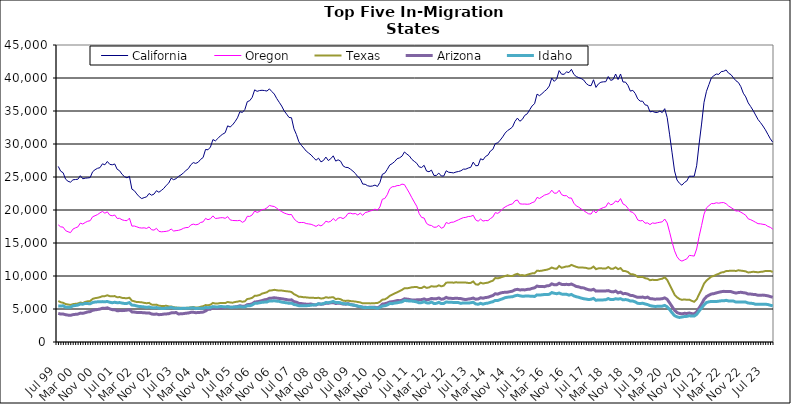
| Category |  California  |  Oregon  |  Texas  |  Arizona  |  Idaho  |
|---|---|---|---|---|---|
| Jul 99 | 26605 | 17749 | 6209 | 4339 | 5471 |
| Aug 99 | 25882 | 17447 | 6022 | 4228 | 5444 |
| Sep 99 | 25644 | 17401 | 5941 | 4237 | 5488 |
| Oct 99 | 24669 | 16875 | 5751 | 4134 | 5279 |
| Nov 99 | 24353 | 16701 | 5680 | 4073 | 5260 |
| Dec 99 | 24218 | 16570 | 5619 | 4042 | 5269 |
| Jan 00 | 24574 | 17109 | 5736 | 4142 | 5485 |
| Feb 00 | 24620 | 17295 | 5789 | 4192 | 5530 |
| Mar 00 | 24655 | 17436 | 5826 | 4226 | 5590 |
| Apr 00 | 25195 | 18009 | 5980 | 4375 | 5748 |
| May 00 | 24730 | 17875 | 5897 | 4337 | 5729 |
| Jun 00 | 24825 | 18113 | 6070 | 4444 | 5853 |
| Jul 00 | 24857 | 18294 | 6163 | 4555 | 5824 |
| Aug 00 | 24913 | 18376 | 6199 | 4603 | 5788 |
| Sep 00 | 25792 | 18971 | 6529 | 4804 | 5976 |
| Oct 00 | 26106 | 19135 | 6643 | 4870 | 6058 |
| Nov 00 | 26315 | 19306 | 6705 | 4926 | 6085 |
| Dec 00 | 26415 | 19570 | 6793 | 4991 | 6096 |
| Jan 01 | 26995 | 19781 | 6942 | 5122 | 6119 |
| Feb 01 | 26851 | 19519 | 6948 | 5089 | 6090 |
| Mar 01 | 27352 | 19720 | 7080 | 5180 | 6143 |
| Apr 01 | 26918 | 19221 | 6943 | 5020 | 6020 |
| May 01 | 26848 | 19126 | 6924 | 4899 | 5950 |
| Jun 01 | 26974 | 19241 | 6959 | 4895 | 6019 |
| Jul 01 | 26172 | 18725 | 6778 | 4737 | 5951 |
| Aug 01 | 25943 | 18736 | 6810 | 4757 | 5973 |
| Sep 01 | 25399 | 18514 | 6688 | 4753 | 5895 |
| Oct 01 | 25050 | 18415 | 6650 | 4780 | 5833 |
| Nov 01 | 24873 | 18381 | 6631 | 4826 | 5850 |
| Dec 01 | 25099 | 18765 | 6708 | 4898 | 5969 |
| Jan 02 | 23158 | 17561 | 6261 | 4560 | 5595 |
| Feb 02 | 22926 | 17573 | 6162 | 4531 | 5560 |
| Mar 02 | 22433 | 17452 | 6052 | 4481 | 5458 |
| Apr 02 | 22012 | 17314 | 6046 | 4458 | 5380 |
| May 02 | 21733 | 17267 | 6007 | 4452 | 5358 |
| Jun 02 | 21876 | 17298 | 5933 | 4444 | 5315 |
| Jul 02 | 21997 | 17209 | 5873 | 4383 | 5243 |
| Aug 02 | 22507 | 17436 | 5929 | 4407 | 5315 |
| Sep 02 | 22244 | 17010 | 5672 | 4248 | 5192 |
| Oct 02 | 22406 | 16952 | 5625 | 4191 | 5167 |
| Nov 02 | 22922 | 17223 | 5663 | 4242 | 5221 |
| Dec 02 | 22693 | 16770 | 5499 | 4142 | 5120 |
| Jan 03 | 22964 | 16694 | 5463 | 4166 | 5089 |
| Feb 03 | 23276 | 16727 | 5461 | 4226 | 5077 |
| Mar 03 | 23736 | 16766 | 5486 | 4251 | 5145 |
| Apr 03 | 24079 | 16859 | 5389 | 4289 | 5145 |
| May 03 | 24821 | 17117 | 5378 | 4415 | 5254 |
| Jun 03 | 24592 | 16812 | 5273 | 4426 | 5135 |
| Jul 03 | 24754 | 16875 | 5226 | 4466 | 5124 |
| Aug 03 | 25092 | 16922 | 5181 | 4244 | 5100 |
| Sep 03 | 25316 | 17036 | 5181 | 4279 | 5086 |
| Oct 03 | 25622 | 17228 | 5139 | 4301 | 5110 |
| Nov 03 | 25984 | 17335 | 5175 | 4362 | 5091 |
| Dec 03 | 26269 | 17350 | 5189 | 4396 | 5113 |
| Jan 04 | 26852 | 17734 | 5255 | 4492 | 5152 |
| Feb 04 | 27184 | 17860 | 5301 | 4502 | 5183 |
| Mar 04 | 27062 | 17757 | 5227 | 4443 | 5056 |
| Apr 04 | 27238 | 17840 | 5227 | 4461 | 5104 |
| May 04 | 27671 | 18113 | 5345 | 4493 | 5095 |
| Jun 04 | 27949 | 18201 | 5416 | 4532 | 5103 |
| Jul 04 | 29172 | 18727 | 5597 | 4697 | 5231 |
| Aug 04 | 29122 | 18529 | 5561 | 4945 | 5197 |
| Sep 04 | 29542 | 18678 | 5656 | 4976 | 5237 |
| Oct 04 | 30674 | 19108 | 5922 | 5188 | 5363 |
| Nov 04 | 30472 | 18716 | 5823 | 5106 | 5321 |
| Dec 04 | 30831 | 18755 | 5838 | 5135 | 5312 |
| Jan 05 | 31224 | 18823 | 5906 | 5155 | 5374 |
| Feb 05 | 31495 | 18842 | 5898 | 5168 | 5357 |
| Mar 05 | 31714 | 18738 | 5894 | 5212 | 5313 |
| Apr 05 | 32750 | 18998 | 6060 | 5340 | 5350 |
| May 05 | 32575 | 18504 | 5989 | 5269 | 5276 |
| Jun 05 | 32898 | 18414 | 5954 | 5252 | 5271 |
| Jul 05 | 33384 | 18395 | 6062 | 5322 | 5322 |
| Aug 05 | 33964 | 18381 | 6113 | 5375 | 5316 |
| Sep 05 | 34897 | 18426 | 6206 | 5493 | 5362 |
| Oct 05 | 34780 | 18132 | 6100 | 5408 | 5308 |
| Nov 05 | 35223 | 18332 | 6162 | 5434 | 5314 |
| Dec 05 | 36415 | 19047 | 6508 | 5658 | 5487 |
| Jan 06 | 36567 | 19032 | 6576 | 5688 | 5480 |
| Feb 06 | 37074 | 19257 | 6692 | 5792 | 5616 |
| Mar 06 | 38207 | 19845 | 6993 | 6052 | 5850 |
| Apr 06 | 37976 | 19637 | 7024 | 6101 | 5864 |
| May 06 | 38099 | 19781 | 7114 | 6178 | 5943 |
| Jun 06 | 38141 | 20061 | 7331 | 6276 | 6018 |
| Jul 06 | 38097 | 20111 | 7431 | 6399 | 6046 |
| Aug 06 | 38021 | 20333 | 7542 | 6450 | 6064 |
| Sep 06 | 38349 | 20686 | 7798 | 6627 | 6232 |
| Oct 06 | 37947 | 20591 | 7825 | 6647 | 6216 |
| Nov 06 | 37565 | 20526 | 7907 | 6707 | 6244 |
| Dec 06 | 36884 | 20272 | 7840 | 6648 | 6192 |
| Jan 07 | 36321 | 19984 | 7789 | 6597 | 6151 |
| Feb 07 | 35752 | 19752 | 7799 | 6554 | 6048 |
| Mar 07 | 35025 | 19547 | 7737 | 6487 | 5989 |
| Apr 07 | 34534 | 19412 | 7685 | 6430 | 5937 |
| May 07 | 34022 | 19296 | 7654 | 6353 | 5858 |
| Jun 07 | 33974 | 19318 | 7577 | 6390 | 5886 |
| Jul 07 | 32298 | 18677 | 7250 | 6117 | 5682 |
| Aug 07 | 31436 | 18322 | 7070 | 6034 | 5617 |
| Sep 07 | 30331 | 18087 | 6853 | 5847 | 5500 |
| Oct 07 | 29813 | 18108 | 6839 | 5821 | 5489 |
| Nov 07 | 29384 | 18105 | 6777 | 5769 | 5481 |
| Dec 07 | 28923 | 17949 | 6760 | 5733 | 5499 |
| Jan 08 | 28627 | 17890 | 6721 | 5732 | 5521 |
| Feb 08 | 28328 | 17834 | 6719 | 5749 | 5579 |
| Mar 08 | 27911 | 17680 | 6690 | 5650 | 5614 |
| Apr 08 | 27543 | 17512 | 6656 | 5612 | 5635 |
| May 08 | 27856 | 17754 | 6705 | 5774 | 5798 |
| Jun 08 | 27287 | 17589 | 6593 | 5717 | 5745 |
| Jul 08 | 27495 | 17834 | 6623 | 5761 | 5807 |
| Aug 08 | 28018 | 18309 | 6789 | 5867 | 5982 |
| Sep-08 | 27491 | 18164 | 6708 | 5864 | 5954 |
| Oct 08 | 27771 | 18291 | 6755 | 5942 | 6032 |
| Nov 08 | 28206 | 18706 | 6787 | 5970 | 6150 |
| Dec 08 | 27408 | 18353 | 6505 | 5832 | 5975 |
| Jan 09 | 27601 | 18778 | 6569 | 5890 | 5995 |
| Feb 09 | 27394 | 18863 | 6483 | 5845 | 5936 |
| Mar 09 | 26690 | 18694 | 6273 | 5751 | 5806 |
| Apr 09 | 26461 | 18943 | 6222 | 5735 | 5777 |
| May 09 | 26435 | 19470 | 6272 | 5819 | 5767 |
| Jun 09 | 26187 | 19522 | 6199 | 5700 | 5649 |
| Jul 09 | 25906 | 19408 | 6171 | 5603 | 5617 |
| Aug 09 | 25525 | 19469 | 6128 | 5533 | 5540 |
| Sep 09 | 25050 | 19249 | 6059 | 5405 | 5437 |
| Oct 09 | 24741 | 19529 | 6004 | 5349 | 5369 |
| Nov 09 | 23928 | 19187 | 5854 | 5271 | 5248 |
| Dec 09 | 23899 | 19607 | 5886 | 5261 | 5195 |
| Jan 10 | 23676 | 19703 | 5881 | 5232 | 5234 |
| Feb 10 | 23592 | 19845 | 5850 | 5272 | 5236 |
| Mar 10 | 23634 | 19946 | 5864 | 5278 | 5219 |
| Apr 10 | 23774 | 20134 | 5889 | 5257 | 5201 |
| May 10 | 23567 | 19966 | 5897 | 5172 | 5105 |
| Jun 10 | 24166 | 20464 | 6087 | 5356 | 5237 |
| Jul 10 | 25410 | 21627 | 6417 | 5742 | 5452 |
| Aug 10 | 25586 | 21744 | 6465 | 5797 | 5491 |
| Sep 10 | 26150 | 22314 | 6667 | 5907 | 5609 |
| Oct 10 | 26807 | 23219 | 6986 | 6070 | 5831 |
| Nov 10 | 27033 | 23520 | 7179 | 6100 | 5810 |
| Dec 10 | 27332 | 23551 | 7361 | 6182 | 5898 |
| Jan 11 | 27769 | 23697 | 7525 | 6276 | 5938 |
| Feb 11 | 27898 | 23718 | 7708 | 6267 | 6016 |
| Mar 11 | 28155 | 23921 | 7890 | 6330 | 6081 |
| Apr 11 | 28790 | 23847 | 8146 | 6544 | 6305 |
| May 11 | 28471 | 23215 | 8131 | 6502 | 6248 |
| Jun 11 | 28191 | 22580 | 8199 | 6445 | 6217 |
| Jul 11 | 27678 | 21867 | 8291 | 6368 | 6202 |
| Aug 11 | 27372 | 21203 | 8321 | 6356 | 6146 |
| Sep 11 | 27082 | 20570 | 8341 | 6387 | 6075 |
| Oct 11 | 26528 | 19442 | 8191 | 6402 | 5932 |
| Nov 11 | 26440 | 18872 | 8176 | 6426 | 5968 |
| Dec 11 | 26770 | 18784 | 8401 | 6533 | 6106 |
| Jan 12 | 25901 | 17963 | 8202 | 6390 | 5933 |
| Feb 12 | 25796 | 17718 | 8266 | 6456 | 5900 |
| Mar 12 | 26042 | 17647 | 8456 | 6600 | 6054 |
| Apr 12 | 25239 | 17386 | 8388 | 6534 | 5838 |
| May 12 | 25238 | 17407 | 8401 | 6558 | 5854 |
| Jun 12 | 25593 | 17673 | 8594 | 6669 | 6009 |
| Jul 12 | 25155 | 17237 | 8432 | 6474 | 5817 |
| Aug 12 | 25146 | 17391 | 8536 | 6539 | 5842 |
| Sep 12 | 25942 | 18102 | 8989 | 6759 | 6061 |
| Oct 12 | 25718 | 17953 | 9012 | 6618 | 6027 |
| Nov 12 | 25677 | 18134 | 9032 | 6611 | 6009 |
| Dec 12 | 25619 | 18166 | 8981 | 6601 | 5999 |
| Jan 13 | 25757 | 18344 | 9051 | 6627 | 5989 |
| Feb-13 | 25830 | 18512 | 9001 | 6606 | 5968 |
| Mar-13 | 25940 | 18689 | 9021 | 6577 | 5853 |
| Apr 13 | 26187 | 18844 | 9013 | 6478 | 5925 |
| May 13 | 26192 | 18884 | 9003 | 6431 | 5924 |
| Jun-13 | 26362 | 19013 | 8948 | 6508 | 5896 |
| Jul 13 | 26467 | 19037 | 8958 | 6559 | 5948 |
| Aug 13 | 27253 | 19198 | 9174 | 6655 | 6020 |
| Sep 13 | 26711 | 18501 | 8747 | 6489 | 5775 |
| Oct 13 | 26733 | 18301 | 8681 | 6511 | 5711 |
| Nov 13 | 27767 | 18620 | 8989 | 6709 | 5860 |
| Dec 13 | 27583 | 18320 | 8863 | 6637 | 5740 |
| Jan 14 | 28107 | 18409 | 8939 | 6735 | 5843 |
| Feb-14 | 28313 | 18383 | 8989 | 6779 | 5893 |
| Mar 14 | 28934 | 18696 | 9160 | 6918 | 6015 |
| Apr 14 | 29192 | 18946 | 9291 | 7036 | 6099 |
| May 14 | 30069 | 19603 | 9701 | 7314 | 6304 |
| Jun 14 | 30163 | 19487 | 9641 | 7252 | 6293 |
| Jul-14 | 30587 | 19754 | 9752 | 7415 | 6427 |
| Aug-14 | 31074 | 20201 | 9882 | 7499 | 6557 |
| Sep 14 | 31656 | 20459 | 9997 | 7536 | 6719 |
| Oct 14 | 32037 | 20663 | 10109 | 7555 | 6786 |
| Nov 14 | 32278 | 20825 | 9992 | 7628 | 6831 |
| Dec 14 | 32578 | 20918 | 10006 | 7705 | 6860 |
| Jan 15 | 33414 | 21396 | 10213 | 7906 | 7000 |
| Feb 15 | 33922 | 21518 | 10337 | 7982 | 7083 |
| Mar 15 | 33447 | 20942 | 10122 | 7891 | 7006 |
| Apr-15 | 33731 | 20893 | 10138 | 7906 | 6931 |
| May 15 | 34343 | 20902 | 10053 | 7895 | 6952 |
| Jun-15 | 34572 | 20870 | 10192 | 7973 | 6966 |
| Jul 15 | 35185 | 20916 | 10303 | 8000 | 6949 |
| Aug 15 | 35780 | 21115 | 10399 | 8126 | 6938 |
| Sep 15 | 36109 | 21246 | 10428 | 8207 | 6896 |
| Oct 15 | 37555 | 21908 | 10813 | 8477 | 7140 |
| Nov 15 | 37319 | 21750 | 10763 | 8390 | 7112 |
| Dec 15 | 37624 | 21990 | 10807 | 8395 | 7149 |
| Jan 16 | 37978 | 22248 | 10892 | 8388 | 7201 |
| Feb 16 | 38285 | 22369 | 10951 | 8508 | 7192 |
| Mar 16 | 38792 | 22506 | 11075 | 8547 | 7226 |
| Apr 16 | 39994 | 22999 | 11286 | 8815 | 7487 |
| May 16 | 39488 | 22548 | 11132 | 8673 | 7382 |
| Jun 16 | 39864 | 22556 | 11100 | 8682 | 7315 |
| Jul 16 | 41123 | 22989 | 11516 | 8903 | 7420 |
| Aug 16 | 40573 | 22333 | 11251 | 8731 | 7261 |
| Sep 16 | 40560 | 22162 | 11340 | 8692 | 7216 |
| Oct 16 | 40923 | 22172 | 11456 | 8742 | 7233 |
| Nov 16 | 40817 | 21818 | 11459 | 8685 | 7101 |
| Dec 16 | 41311 | 21815 | 11681 | 8783 | 7203 |
| Jan 17 | 40543 | 21029 | 11524 | 8609 | 6982 |
| Feb 17 | 40218 | 20613 | 11385 | 8416 | 6852 |
| Mar 17 | 40052 | 20425 | 11276 | 8354 | 6775 |
| Apr 17 | 39913 | 20147 | 11297 | 8218 | 6653 |
| May 17 | 39695 | 19910 | 11265 | 8196 | 6552 |
| Jun 17 | 39177 | 19650 | 11225 | 8034 | 6500 |
| Jul 17 | 38901 | 19419 | 11115 | 7923 | 6429 |
| Aug 17 | 38827 | 19389 | 11168 | 7867 | 6479 |
| Sep 17 | 39736 | 19936 | 11426 | 7991 | 6609 |
| Oct 17 | 38576 | 19547 | 11041 | 7708 | 6315 |
| Nov 17 | 39108 | 20013 | 11158 | 7746 | 6381 |
| Dec 17 | 39359 | 20202 | 11185 | 7743 | 6366 |
| Jan 18 | 39420 | 20362 | 11118 | 7736 | 6380 |
| Feb 18 | 39440 | 20476 | 11128 | 7741 | 6407 |
| Mar 18 | 40218 | 21106 | 11362 | 7789 | 6578 |
| Apr 18 | 39637 | 20788 | 11111 | 7642 | 6423 |
| May 18 | 39777 | 20933 | 11097 | 7591 | 6430 |
| Jun 18 | 40602 | 21381 | 11317 | 7721 | 6554 |
| Jul 18 | 39767 | 21189 | 11038 | 7445 | 6489 |
| Aug 18 | 40608 | 21729 | 11200 | 7560 | 6569 |
| Sep 18 | 39395 | 20916 | 10772 | 7318 | 6383 |
| Oct 18 | 39383 | 20724 | 10740 | 7344 | 6429 |
| Nov 18 | 38891 | 20265 | 10605 | 7255 | 6365 |
| Dec 18 | 38013 | 19741 | 10292 | 7069 | 6205 |
| Jan 19 | 38130 | 19643 | 10261 | 7032 | 6203 |
| Feb 19 | 37658 | 19237 | 10132 | 6892 | 6073 |
| Mar 19 | 36831 | 18492 | 9848 | 6766 | 5863 |
| Apr 19 | 36492 | 18349 | 9839 | 6763 | 5827 |
| May 19 | 36481 | 18407 | 9867 | 6809 | 5873 |
| Jun 19 | 35925 | 17998 | 9661 | 6698 | 5761 |
| Jul 19 | 35843 | 18049 | 9598 | 6800 | 5673 |
| Aug 19 | 34870 | 17785 | 9361 | 6577 | 5512 |
| Sep 19 | 34945 | 18038 | 9428 | 6547 | 5437 |
| Oct 19 | 34802 | 17977 | 9385 | 6483 | 5390 |
| Nov 19 | 34775 | 18072 | 9403 | 6511 | 5401 |
| Dec 19 | 34976 | 18140 | 9518 | 6521 | 5419 |
| Jan 20 | 34774 | 18209 | 9594 | 6561 | 5434 |
| Feb 20 | 35352 | 18632 | 9804 | 6682 | 5543 |
| Mar 20 | 34013 | 18041 | 9411 | 6464 | 5330 |
| Apr 20 | 31385 | 16629 | 8666 | 5922 | 4906 |
| May 20 | 28657 | 15123 | 7927 | 5355 | 4419 |
| Jun 20 | 25915 | 13817 | 7164 | 4815 | 3992 |
| Jul 20 | 24545 | 12926 | 6776 | 4457 | 3810 |
| Aug 20 | 24048 | 12443 | 6521 | 4326 | 3720 |
| Sep 20 | 23756 | 12258 | 6386 | 4266 | 3784 |
| Oct 20 | 24166 | 12429 | 6452 | 4347 | 3861 |
| Nov 20 | 24404 | 12597 | 6386 | 4324 | 3883 |
| Dec 20 | 25120 | 13122 | 6420 | 4394 | 3974 |
| Jan 21 | 25111 | 13080 | 6236 | 4304 | 3924 |
| Feb 21 | 25114 | 13015 | 6094 | 4260 | 3930 |
| Mar 21 | 26701 | 14096 | 6455 | 4567 | 4185 |
| Apr 21 | 29998 | 15978 | 7222 | 5164 | 4697 |
| May 21 | 33020 | 17641 | 7969 | 5748 | 5148 |
| Jun 21 | 36320 | 19369 | 8840 | 6450 | 5628 |
| Jul 21 | 37989 | 20320 | 9306 | 6877 | 5984 |
| Aug 21 | 39007 | 20657 | 9615 | 7094 | 6084 |
| Sep 21 | 40023 | 20974 | 9914 | 7277 | 6151 |
| Oct 21 | 40348 | 20966 | 10003 | 7327 | 6140 |
| Nov 21 | 40599 | 21096 | 10203 | 7437 | 6136 |
| Dec 21 | 40548 | 21032 | 10328 | 7532 | 6183 |
| Jan 22 | 40967 | 21106 | 10535 | 7618 | 6237 |
| Feb 22 | 41019 | 21125 | 10579 | 7673 | 6236 |
| Mar 22 | 41220 | 20949 | 10751 | 7660 | 6310 |
| Apr 22 | 40730 | 20602 | 10772 | 7661 | 6221 |
| May 22 | 40504 | 20370 | 10792 | 7636 | 6210 |
| Jun 22 | 40013 | 20127 | 10802 | 7504 | 6199 |
| Jul 22 | 39582 | 19846 | 10761 | 7419 | 6050 |
| Aug 22 | 39321 | 19865 | 10868 | 7487 | 6071 |
| Sep 22 | 38685 | 19666 | 10811 | 7536 | 6074 |
| Oct 22 | 37700 | 19450 | 10764 | 7469 | 6042 |
| Nov 22 | 37133 | 19198 | 10701 | 7425 | 6042 |
| Dec 22 | 36232 | 18659 | 10527 | 7261 | 5898 |
| Jan 23 | 35674 | 18528 | 10578 | 7263 | 5879 |
| Feb 23 | 35072 | 18344 | 10642 | 7211 | 5827 |
| Mar 23 | 34396 | 18133 | 10609 | 7183 | 5713 |
| Apr 23 | 33708 | 17931 | 10559 | 7074 | 5706 |
| May 23 | 33245 | 17904 | 10624 | 7091 | 5712 |
| Jun 23 | 32727 | 17831 | 10663 | 7105 | 5726 |
| Jul 23 | 32148 | 17773 | 10760 | 7058 | 5719 |
| Aug 23 | 31461 | 17513 | 10759 | 6999 | 5681 |
| Sep 23 | 30794 | 17376 | 10754 | 6882 | 5566 |
| Oct 23 | 30268 | 17096 | 10620 | 6775 | 5477 |